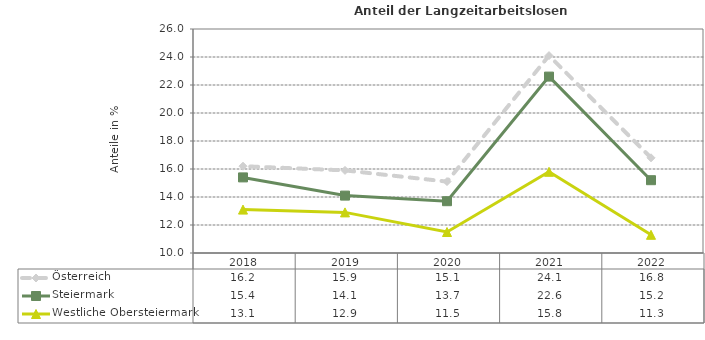
| Category | Österreich | Steiermark | Westliche Obersteiermark |
|---|---|---|---|
| 2022.0 | 16.8 | 15.2 | 11.3 |
| 2021.0 | 24.1 | 22.6 | 15.8 |
| 2020.0 | 15.1 | 13.7 | 11.5 |
| 2019.0 | 15.9 | 14.1 | 12.9 |
| 2018.0 | 16.2 | 15.4 | 13.1 |